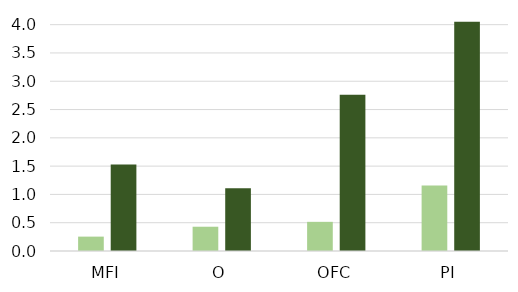
| Category | 2018 | 2022 |
|---|---|---|
| MFI | 0.254 | 1.529 |
| O | 0.429 | 1.109 |
| OFC | 0.515 | 2.761 |
| PI | 1.157 | 4.05 |